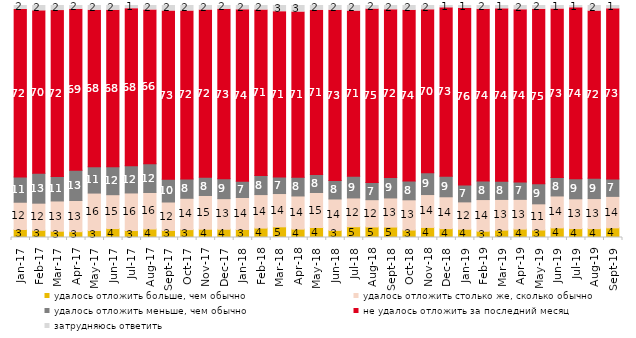
| Category | удалось отложить больше, чем обычно | удалось отложить столько же, сколько обычно | удалось отложить меньше, чем обычно | не удалось отложить за последний месяц | затрудняюсь ответить |
|---|---|---|---|---|---|
| 2017-01-01 | 3.45 | 11.75 | 10.9 | 72.2 | 1.7 |
| 2017-02-01 | 3.1 | 11.7 | 12.85 | 70.05 | 2.3 |
| 2017-03-01 | 2.7 | 13.05 | 10.55 | 71.5 | 2.2 |
| 2017-04-01 | 2.5 | 13.45 | 13 | 69.4 | 1.6 |
| 2017-05-01 | 3 | 16.15 | 11.35 | 67.5 | 2 |
| 2017-06-01 | 3.85 | 14.6 | 12 | 67.5 | 2.05 |
| 2017-07-01 | 3 | 16.2 | 11.75 | 67.7 | 1.35 |
| 2017-08-01 | 3.65 | 15.75 | 12.4 | 66.3 | 1.9 |
| 2017-09-01 | 3.05 | 12.25 | 9.8 | 72.55 | 2.35 |
| 2017-10-01 | 3.4 | 13.5 | 8.3 | 72.45 | 2.35 |
| 2017-11-01 | 3.55 | 14.55 | 7.85 | 72.05 | 1.95 |
| 2017-12-01 | 3.55 | 13.2 | 8.55 | 73.1 | 1.6 |
| 2018-01-01 | 3.45 | 13.8 | 7 | 73.9 | 1.85 |
| 2018-02-01 | 4.05 | 14.45 | 8.25 | 71.3 | 1.95 |
| 2018-03-01 | 4.6 | 14.35 | 7.1 | 71.3 | 2.65 |
| 2018-04-01 | 3.6 | 14.3 | 8.05 | 71.25 | 2.8 |
| 2018-05-01 | 4.3 | 15.1 | 7.75 | 70.75 | 2.1 |
| 2018-06-01 | 3.05 | 13.55 | 7.95 | 73.4 | 2.05 |
| 2018-07-01 | 4.65 | 12.4 | 9.35 | 71.2 | 2.4 |
| 2018-08-01 | 4.55 | 11.75 | 7.45 | 74.7 | 1.55 |
| 2018-09-01 | 4.5 | 12.55 | 8.8 | 72.3 | 1.85 |
| 2018-10-01 | 3.2 | 13.05 | 8.05 | 73.6 | 2.1 |
| 2018-11-01 | 4.341 | 14.172 | 9.381 | 70.259 | 1.846 |
| 2018-12-01 | 3.8 | 13.75 | 8.9 | 72.55 | 1 |
| 2019-01-01 | 3.55 | 11.8 | 7.25 | 76.1 | 1.3 |
| 2019-02-01 | 2.7 | 13.65 | 7.95 | 74.05 | 1.65 |
| 2019-03-01 | 3.182 | 13.227 | 7.857 | 74.291 | 1.442 |
| 2019-04-01 | 3.614 | 12.822 | 7.475 | 74.257 | 1.832 |
| 2019-05-01 | 3.219 | 11.293 | 8.618 | 75.285 | 1.585 |
| 2019-06-01 | 4.14 | 13.766 | 7.93 | 72.668 | 1.496 |
| 2019-07-01 | 3.812 | 12.871 | 8.663 | 73.663 | 0.99 |
| 2019-08-01 | 3.796 | 12.987 | 8.791 | 72.028 | 2.398 |
| 2019-09-01 | 4.158 | 13.564 | 7.475 | 73.366 | 1.436 |